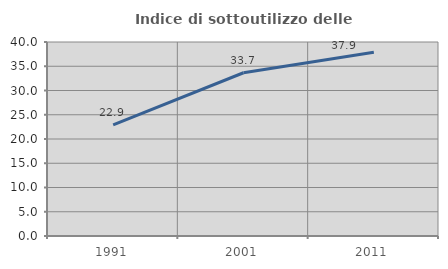
| Category | Indice di sottoutilizzo delle abitazioni  |
|---|---|
| 1991.0 | 22.904 |
| 2001.0 | 33.656 |
| 2011.0 | 37.886 |